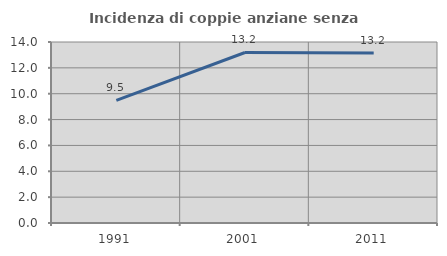
| Category | Incidenza di coppie anziane senza figli  |
|---|---|
| 1991.0 | 9.481 |
| 2001.0 | 13.189 |
| 2011.0 | 13.154 |